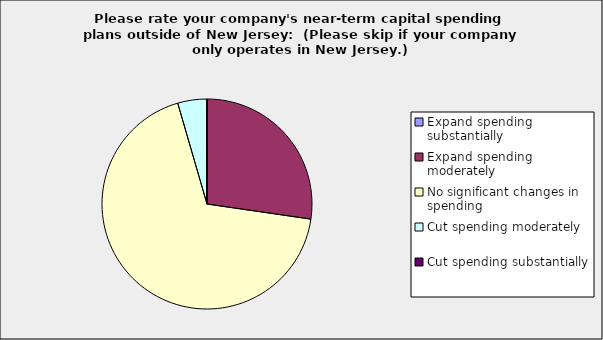
| Category | Series 0 |
|---|---|
| Expand spending substantially | 0 |
| Expand spending moderately | 0.273 |
| No significant changes in spending | 0.682 |
| Cut spending moderately | 0.045 |
| Cut spending substantially | 0 |